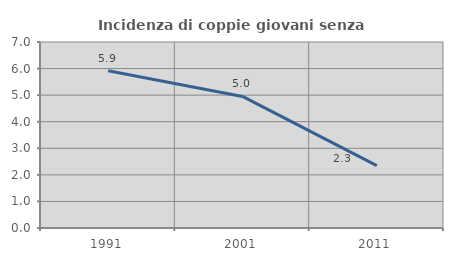
| Category | Incidenza di coppie giovani senza figli |
|---|---|
| 1991.0 | 5.915 |
| 2001.0 | 4.951 |
| 2011.0 | 2.348 |